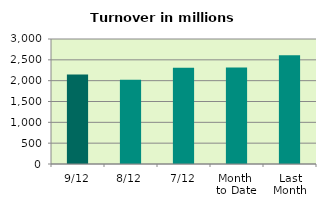
| Category | Series 0 |
|---|---|
| 9/12 | 2145.505 |
| 8/12 | 2020.935 |
| 7/12 | 2310.579 |
| Month 
to Date | 2318.918 |
| Last
Month | 2611.78 |